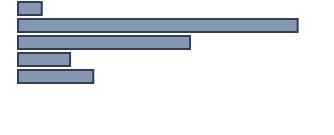
| Category | Series 0 |
|---|---|
| 0 | 7.7 |
| 1 | 90.2 |
| 2 | 55.5 |
| 3 | 16.8 |
| 4 | 24.3 |
| 5 | 0 |
| 6 | 0 |